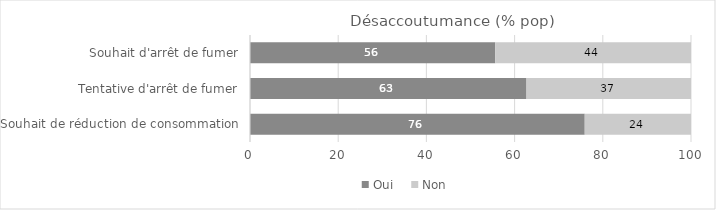
| Category | Oui | Non |
|---|---|---|
| Souhait d'arrêt de fumer | 55.6 | 44.4 |
| Tentative d'arrêt de fumer | 62.7 | 37.3 |
| Souhait de réduction de consommation | 75.9 | 24.1 |